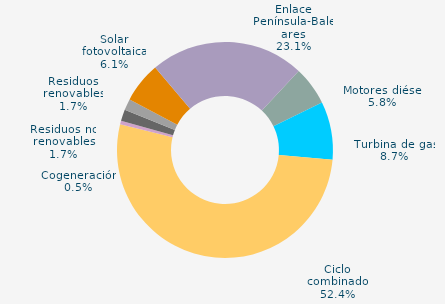
| Category | Series 0 |
|---|---|
| Carbón | 0 |
| Motores diésel | 5.794 |
| Turbina de gas | 8.709 |
| Ciclo combinado | 52.369 |
| Generación auxiliar | 0 |
| Cogeneración | 0.549 |
| Residuos no renovables | 1.698 |
| Residuos renovables | 1.698 |
| Eólica | 0 |
| Solar fotovoltaica | 6.051 |
| Otras renovables | 0.006 |
| Enlace Península-Baleares | 23.126 |